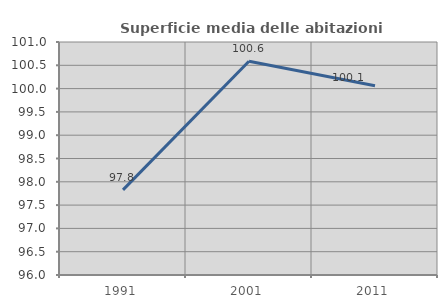
| Category | Superficie media delle abitazioni occupate |
|---|---|
| 1991.0 | 97.827 |
| 2001.0 | 100.588 |
| 2011.0 | 100.06 |